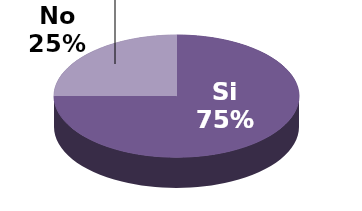
| Category | Series 1 |
|---|---|
| Si | 9 |
| No | 3 |